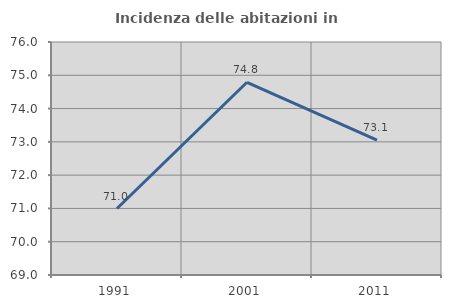
| Category | Incidenza delle abitazioni in proprietà  |
|---|---|
| 1991.0 | 70.998 |
| 2001.0 | 74.79 |
| 2011.0 | 73.052 |